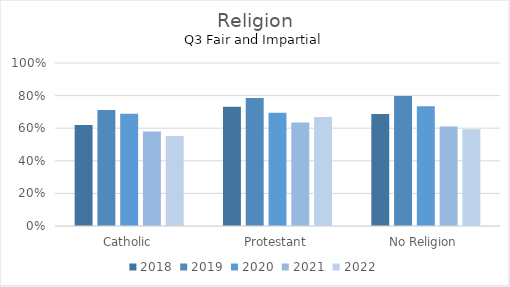
| Category | 2018 | 2019 | 2020 | 2021 | 2022 |
|---|---|---|---|---|---|
| Catholic | 0.62 | 0.711 | 0.688 | 0.579 | 0.552 |
| Protestant | 0.732 | 0.785 | 0.695 | 0.635 | 0.668 |
| No Religion | 0.687 | 0.797 | 0.735 | 0.61 | 0.593 |